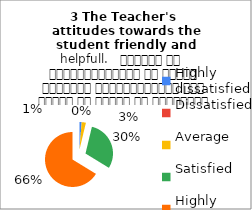
| Category | 3 The Teacher's 
attitudes towards the student friendly and helpfull.   शिक्षक का विद्यार्थियों के प्रति व्यवहार मित्रतापूर्ण एवम सहयोग के भावना से परिपूर्ण था |
|---|---|
| Highly dissatisfied | 1 |
| Dissatisfied | 0 |
| Average | 2 |
| Satisfied | 24 |
| Highly satisfied | 53 |